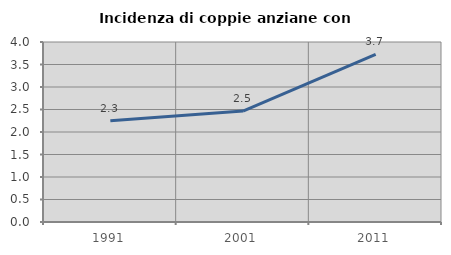
| Category | Incidenza di coppie anziane con figli |
|---|---|
| 1991.0 | 2.252 |
| 2001.0 | 2.466 |
| 2011.0 | 3.727 |